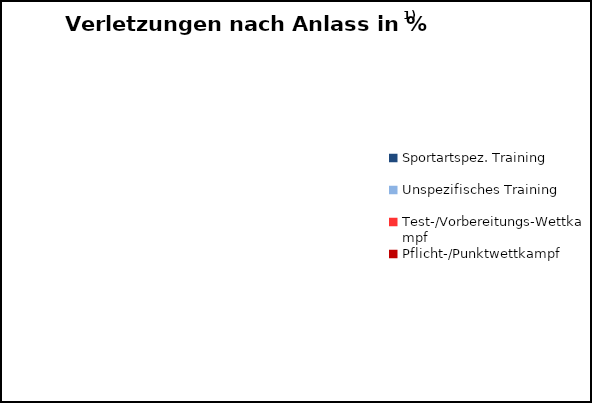
| Category | Series 0 |
|---|---|
| Sportartspez. Training | 0 |
| Unspezifisches Training | 0 |
| Test-/Vorbereitungs-Wettkampf | 0 |
| Pflicht-/Punktwettkampf | 0 |